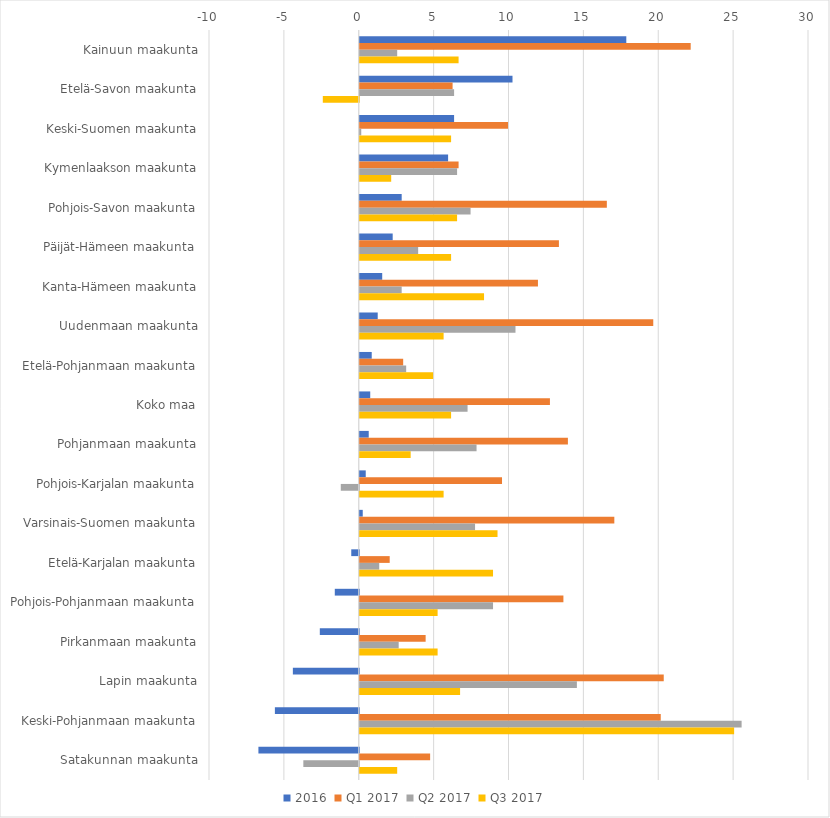
| Category | 2016 | Q1 2017 | Q2 2017 | Q3 2017 |
|---|---|---|---|---|
| Kainuun maakunta | 17.8 | 22.1 | 2.5 | 6.6 |
| Etelä-Savon maakunta | 10.2 | 6.2 | 6.3 | -2.4 |
| Keski-Suomen maakunta | 6.3 | 9.9 | 0.1 | 6.1 |
| Kymenlaakson maakunta | 5.9 | 6.6 | 6.5 | 2.1 |
| Pohjois-Savon maakunta | 2.8 | 16.5 | 7.4 | 6.5 |
| Päijät-Hämeen maakunta | 2.2 | 13.3 | 3.9 | 6.1 |
| Kanta-Hämeen maakunta | 1.5 | 11.9 | 2.8 | 8.3 |
| Uudenmaan maakunta | 1.2 | 19.6 | 10.4 | 5.6 |
| Etelä-Pohjanmaan maakunta | 0.8 | 2.9 | 3.1 | 4.9 |
| Koko maa | 0.7 | 12.7 | 7.2 | 6.1 |
| Pohjanmaan maakunta | 0.6 | 13.9 | 7.8 | 3.4 |
| Pohjois-Karjalan maakunta | 0.4 | 9.5 | -1.2 | 5.6 |
| Varsinais-Suomen maakunta | 0.2 | 17 | 7.7 | 9.2 |
| Etelä-Karjalan maakunta | -0.5 | 2 | 1.3 | 8.9 |
| Pohjois-Pohjanmaan maakunta | -1.6 | 13.6 | 8.9 | 5.2 |
| Pirkanmaan maakunta | -2.6 | 4.4 | 2.6 | 5.2 |
| Lapin maakunta | -4.4 | 20.3 | 14.5 | 6.7 |
| Keski-Pohjanmaan maakunta | -5.6 | 20.1 | 25.5 | 25 |
| Satakunnan maakunta | -6.7 | 4.7 | -3.7 | 2.5 |